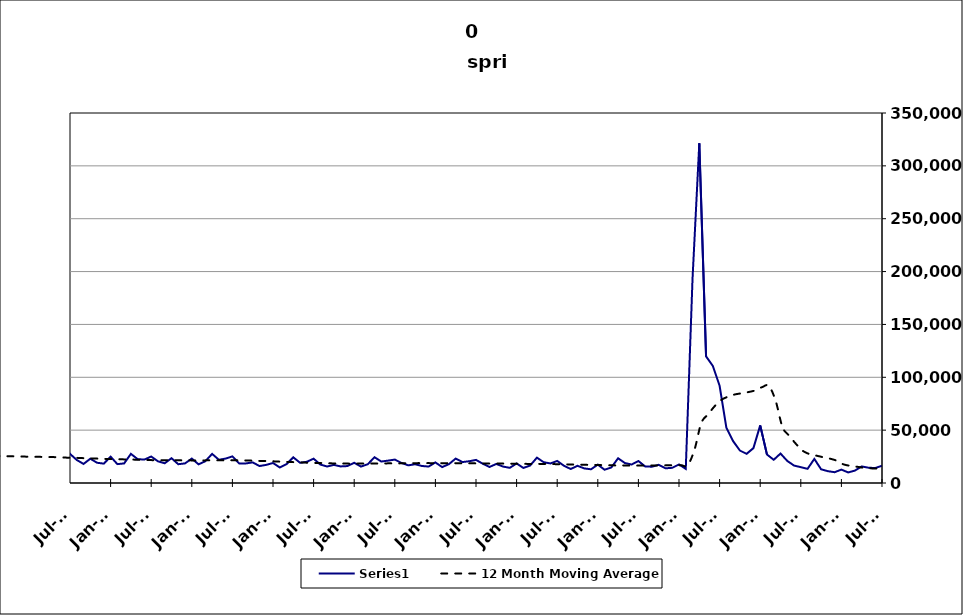
| Category | Series 0 |
|---|---|
| 2005-06-30 | 15559 |
| 2005-07-31 | 18863 |
| 2005-08-31 | 13688 |
| 2005-09-30 | 11216 |
| 2005-10-31 | 15195 |
| 2005-11-30 | 11106 |
| 2005-12-31 | 12178 |
| 2006-01-31 | 12307 |
| 2006-02-28 | 9756 |
| 2006-03-31 | 11166 |
| 2006-04-30 | 18194 |
| 2006-05-31 | 13863 |
| 2006-06-30 | 14337 |
| 2006-07-31 | 17845 |
| 2006-08-31 | 13259 |
| 2006-09-30 | 13170 |
| 2006-10-31 | 14318 |
| 2006-11-30 | 12528 |
| 2006-12-31 | 14662 |
| 2007-01-31 | 14365 |
| 2007-02-28 | 12004 |
| 2007-03-31 | 15715 |
| 2007-04-30 | 21487 |
| 2007-05-31 | 15927 |
| 2007-06-30 | 20117 |
| 2007-07-30 | 19634 |
| 2007-08-31 | 15908 |
| 2007-09-30 | 17289 |
| 2007-10-31 | 17016 |
| 2007-11-15 | 14868 |
| 2007-12-15 09:36:00 | 15051 |
| 2008-01-14 19:12:00 | 19519 |
| 2008-02-14 04:48:00 | 17071 |
| 2008-03-15 14:24:00 | 18041 |
| 2008-04-15 | 26337 |
| 2008-05-15 09:36:00 | 21529 |
| 2008-06-14 19:12:00 | 24509 |
| 2008-07-15 04:48:00 | 26739 |
| 2008-08-14 14:24:00 | 22508 |
| 2008-09-14 | 24197 |
| 2008-10-14 09:36:00 | 30666 |
| 2008-11-13 19:12:00 | 30363 |
| 2008-12-14 04:48:00 | 34409 |
| 2009-01-13 14:24:00 | 39076 |
| 2009-02-13 | 34958 |
| 2009-03-15 09:36:00 | 39174 |
| 2009-04-14 19:12:00 | 41068 |
| 2009-05-15 04:48:00 | 34839 |
| 2009-06-14 14:24:00 | 38758 |
| 2009-07-15 | 38827 |
| 2009-08-14 09:36:00 | 32747 |
| 2009-09-13 19:12:00 | 30654 |
| 2009-10-14 04:48:00 | 31279 |
| 2009-11-13 14:24:00 | 28764 |
| 2009-12-14 | 28567 |
| 2010-01-13 09:36:00 | 31536 |
| 2010-02-12 19:12:00 | 23411 |
| 2010-03-15 04:48:00 | 27064 |
| 2010-04-14 14:24:00 | 31806 |
| 2010-05-15 | 27535 |
| 2010-06-14 09:36:00 | 30999 |
| 2010-07-14 19:12:00 | 30859 |
| 2010-08-14 04:48:00 | 27473 |
| 2010-09-13 14:24:00 | 23569 |
| 2010-10-14 | 26397 |
| 2010-11-13 09:36:00 | 23332 |
| 2010-12-13 19:12:00 | 23208 |
| 2011-01-13 04:48:00 | 29123 |
| 2011-02-12 14:24:00 | 19880 |
| 2011-03-15 | 23037 |
| 2011-04-14 09:36:00 | 29838 |
| 2011-05-14 19:12:00 | 26805 |
| 2011-06-14 04:48:00 | 27951 |
| 2011-07-14 14:24:00 | 27959 |
| 2011-08-14 | 25368 |
| 2011-09-13 09:36:00 | 21516 |
| 2011-10-13 19:12:00 | 25249 |
| 2011-11-13 04:48:00 | 21348 |
| 2011-12-13 14:24:00 | 21373 |
| 2012-01-13 | 26870 |
| 2012-02-12 09:36:00 | 19799 |
| 2012-03-13 19:12:00 | 20523 |
| 2012-04-13 04:48:00 | 29208 |
| 2012-05-13 14:24:00 | 25322 |
| 2012-06-13 | 23562 |
| 2012-07-13 09:36:00 | 27564 |
| 2012-08-12 19:12:00 | 21787 |
| 2012-09-12 04:48:00 | 18024 |
| 2012-10-12 14:24:00 | 22967 |
| 2012-11-12 | 19147 |
| 2012-12-12 09:36:00 | 18332 |
| 2013-01-11 19:12:00 | 24929 |
| 2013-02-11 04:48:00 | 17864 |
| 2013-03-13 14:24:00 | 18518 |
| 2013-04-13 | 27564 |
| 2013-05-13 09:36:00 | 22544 |
| 2013-06-12 19:12:00 | 22178 |
| 2013-07-13 04:48:00 | 25052 |
| 2013-08-12 14:24:00 | 20510 |
| 2013-09-12 | 18652 |
| 2013-10-12 09:36:00 | 23457 |
| 2013-11-11 19:12:00 | 17762 |
| 2013-12-12 04:48:00 | 18554 |
| 2014-01-11 14:24:00 | 23110 |
| 2014-02-11 | 17656 |
| 2014-03-13 09:36:00 | 20574 |
| 2014-04-12 19:12:00 | 27528 |
| 2014-05-13 04:48:00 | 22003 |
| 2014-06-12 14:24:00 | 23093 |
| 2014-07-13 | 25159 |
| 2014-08-12 09:36:00 | 18501 |
| 2014-09-11 19:12:00 | 18519 |
| 2014-10-12 04:48:00 | 19501 |
| 2014-11-11 14:24:00 | 16036 |
| 2014-12-12 | 17142 |
| 2015-01-11 09:36:00 | 18920 |
| 2015-02-10 19:12:00 | 14673 |
| 2015-03-13 04:48:00 | 17842 |
| 2015-04-12 14:24:00 | 24284 |
| 2015-05-13 | 19120 |
| 2015-06-12 09:36:00 | 20073 |
| 2015-07-12 19:12:00 | 23007 |
| 2015-08-12 04:48:00 | 17420 |
| 2015-09-11 14:24:00 | 15620 |
| 2015-10-12 | 17117 |
| 2015-11-11 09:36:00 | 15685 |
| 2015-12-11 19:12:00 | 16020 |
| 2016-01-11 04:48:00 | 19143 |
| 2016-02-10 14:24:00 | 15551 |
| 2016-03-12 | 17721 |
| 2016-04-11 09:36:00 | 24381 |
| 2016-05-11 19:12:00 | 20319 |
| 2016-06-11 04:48:00 | 21157 |
| 2016-07-11 14:24:00 | 22155 |
| 2016-08-11 | 18945 |
| 2016-09-10 09:36:00 | 16699 |
| 2016-10-10 19:12:00 | 17773 |
| 2016-11-10 04:48:00 | 16104 |
| 2016-12-10 14:24:00 | 15555 |
| 2017-01-10 | 19468 |
| 2017-02-09 09:36:00 | 15031 |
| 2017-03-11 19:12:00 | 17840 |
| 2017-04-11 04:48:00 | 23124 |
| 2017-05-11 14:24:00 | 19802 |
| 2017-06-11 | 20588 |
| 2017-07-11 09:36:00 | 21858 |
| 2017-08-10 19:12:00 | 18231 |
| 2017-09-10 04:48:00 | 15171 |
| 2017-10-10 14:24:00 | 18027 |
| 2017-11-10 | 15538 |
| 2017-12-10 09:36:00 | 14339 |
| 2018-01-09 19:12:00 | 18538 |
| 2018-02-09 04:48:00 | 14230 |
| 2018-03-11 14:24:00 | 16525 |
| 2018-04-11 | 23962 |
| 2018-05-11 09:36:00 | 19679 |
| 2018-06-10 19:12:00 | 18492 |
| 2018-07-11 04:48:00 | 20879 |
| 2018-08-10 14:24:00 | 16306 |
| 2018-09-10 | 13227 |
| 2018-10-10 09:36:00 | 16273 |
| 2018-11-09 19:12:00 | 13796 |
| 2018-12-10 04:48:00 | 12964 |
| 2019-01-09 14:24:00 | 17391 |
| 2019-02-09 | 12534 |
| 2019-03-11 09:36:00 | 14705 |
| 2019-04-10 19:12:00 | 23399 |
| 2019-05-11 04:48:00 | 18895 |
| 2019-06-10 14:24:00 | 17486 |
| 2019-07-11 | 20792 |
| 2019-08-10 09:36:00 | 15676 |
| 2019-09-09 19:12:00 | 15415 |
| 2019-10-10 04:48:00 | 17202 |
| 2019-11-09 14:24:00 | 13905 |
| 2019-12-10 | 14356 |
| 2020-01-09 09:36:00 | 17551 |
| 2020-02-08 19:12:00 | 13374 |
| 2020-03-10 04:48:00 | 193236 |
| 2020-04-09 14:24:00 | 321397 |
| 2020-05-10 | 119809 |
| 2020-06-09 09:36:00 | 110709 |
| 2020-07-09 19:12:00 | 91992 |
| 2020-08-09 04:48:00 | 52303 |
| 2020-09-08 14:24:00 | 39616 |
| 2020-10-09 | 30687 |
| 2020-11-08 09:36:00 | 27606 |
| 2020-12-08 19:12:00 | 32990 |
| 2021-01-08 04:48:00 | 54483 |
| 2021-02-07 14:24:00 | 26952 |
| 2021-03-10 | 21951 |
| 2021-04-09 09:36:00 | 27881 |
| 2021-05-09 19:12:00 | 20877 |
| 2021-06-09 04:48:00 | 16503 |
| 2021-07-09 14:24:00 | 14975 |
| 2021-08-09 | 13409 |
| 2021-09-08 09:36:00 | 22784 |
| 2021-10-08 19:12:00 | 12970 |
| 2021-11-08 04:48:00 | 11178 |
| 2021-12-08 14:24:00 | 10213 |
| 2022-01-08 | 12675 |
| 2022-02-07 09:36:00 | 10001 |
| 2022-03-09 19:12:00 | 11739 |
| 2022-04-09 04:48:00 | 15679 |
| 2022-05-09 14:24:00 | 14464 |
| 2022-06-09 | 14143 |
| 2022-07-09 09:36:00 | 16322 |